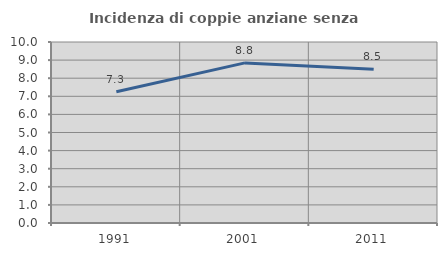
| Category | Incidenza di coppie anziane senza figli  |
|---|---|
| 1991.0 | 7.252 |
| 2001.0 | 8.846 |
| 2011.0 | 8.501 |